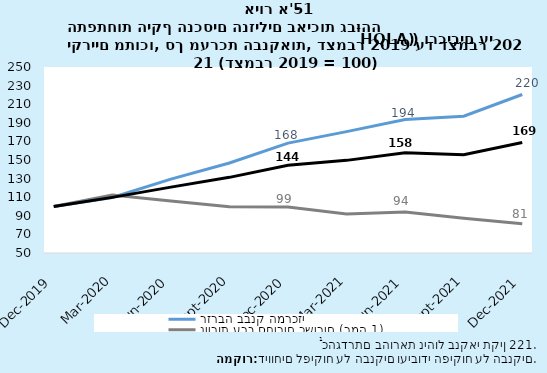
| Category | רזרבה בבנק המרכזי | ניירות ערך סחירים כשירים (רמה 1) | סך HQLA |
|---|---|---|---|
| 2019-12-31 | 100 | 100 | 100 |
| 2020-03-31 | 109.741 | 112.29 | 109.827 |
| 2020-06-30 | 129.399 | 105.868 | 120.856 |
| 2020-09-30 | 146.766 | 99.7 | 131.345 |
| 2020-12-31 | 168.129 | 99.467 | 144.335 |
| 2021-03-31 | 180.512 | 92.034 | 149.609 |
| 2021-06-30 | 193.532 | 94.151 | 157.735 |
| 2021-09-30 | 197.088 | 87.424 | 155.741 |
| 2021-12-31 | 220.449 | 81.389 | 168.903 |